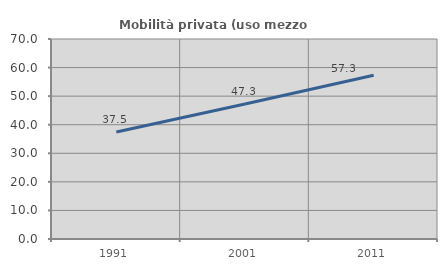
| Category | Mobilità privata (uso mezzo privato) |
|---|---|
| 1991.0 | 37.479 |
| 2001.0 | 47.262 |
| 2011.0 | 57.329 |